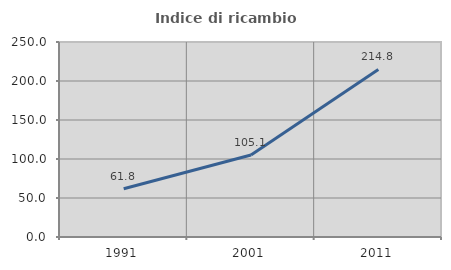
| Category | Indice di ricambio occupazionale  |
|---|---|
| 1991.0 | 61.809 |
| 2001.0 | 105.075 |
| 2011.0 | 214.786 |